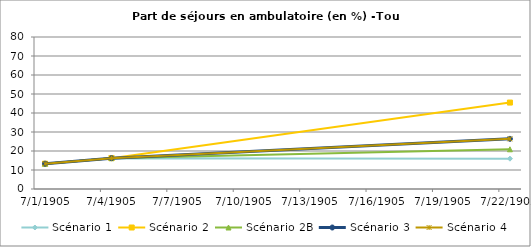
| Category | Scénario 1 | Scénario 2 | Scénario 2B | Scénario 3 | Scénario 4 |
|---|---|---|---|---|---|
| 2009.0 | 13.324 | 13.324 | 13.324 | 13.324 | 13.324 |
| 2012.0 | 16.235 | 16.235 | 16.235 | 16.235 | 16.235 |
| 2030.0 | 15.957 | 45.491 | 20.899 | 26.393 | 26.393 |